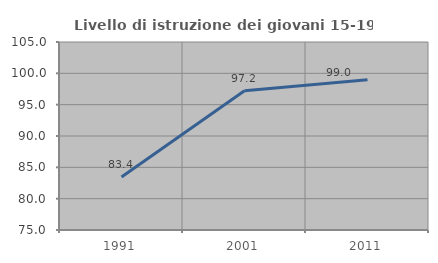
| Category | Livello di istruzione dei giovani 15-19 anni |
|---|---|
| 1991.0 | 83.446 |
| 2001.0 | 97.235 |
| 2011.0 | 98.985 |